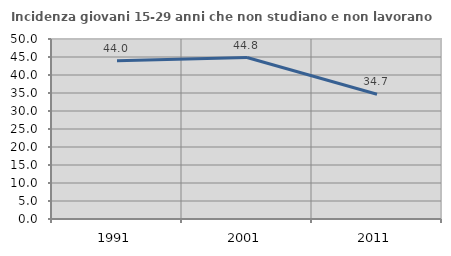
| Category | Incidenza giovani 15-29 anni che non studiano e non lavorano  |
|---|---|
| 1991.0 | 43.98 |
| 2001.0 | 44.85 |
| 2011.0 | 34.661 |